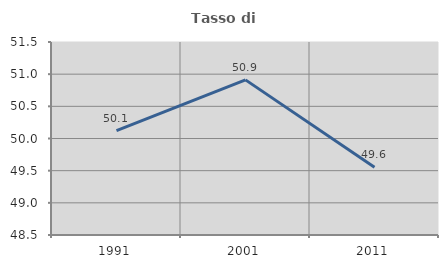
| Category | Tasso di occupazione   |
|---|---|
| 1991.0 | 50.122 |
| 2001.0 | 50.911 |
| 2011.0 | 49.554 |